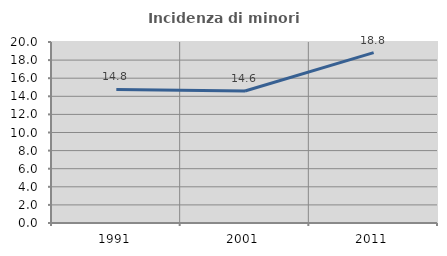
| Category | Incidenza di minori stranieri |
|---|---|
| 1991.0 | 14.754 |
| 2001.0 | 14.592 |
| 2011.0 | 18.827 |